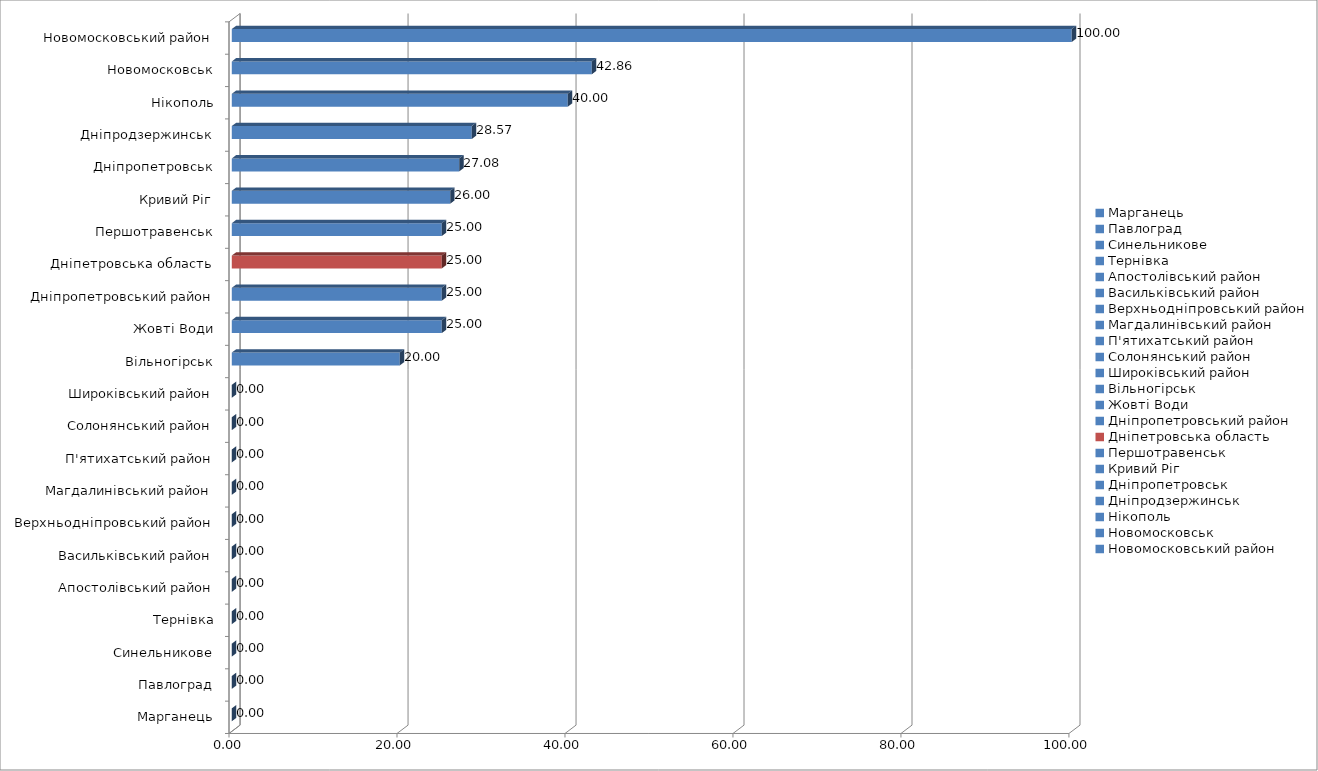
| Category | [160;200) |
|---|---|
| Марганець | 0 |
| Павлоград | 0 |
| Синельникове | 0 |
| Тернівка | 0 |
| Апостолівський район | 0 |
| Васильківський район | 0 |
| Верхньодніпровський район | 0 |
| Магдалинівський район | 0 |
| П'ятихатський район | 0 |
| Солонянський район | 0 |
| Широківський район | 0 |
| Вільногірськ | 19.998 |
| Жовті Води | 24.998 |
| Дніпропетровський район | 24.999 |
| Дніпетровська область | 25 |
| Першотравенськ | 25 |
| Кривий Ріг | 26.001 |
| Дніпропетровськ | 27.083 |
| Дніпродзержинськ | 28.57 |
| Нікополь | 40 |
| Новомосковськ | 42.857 |
| Новомосковський район | 100 |